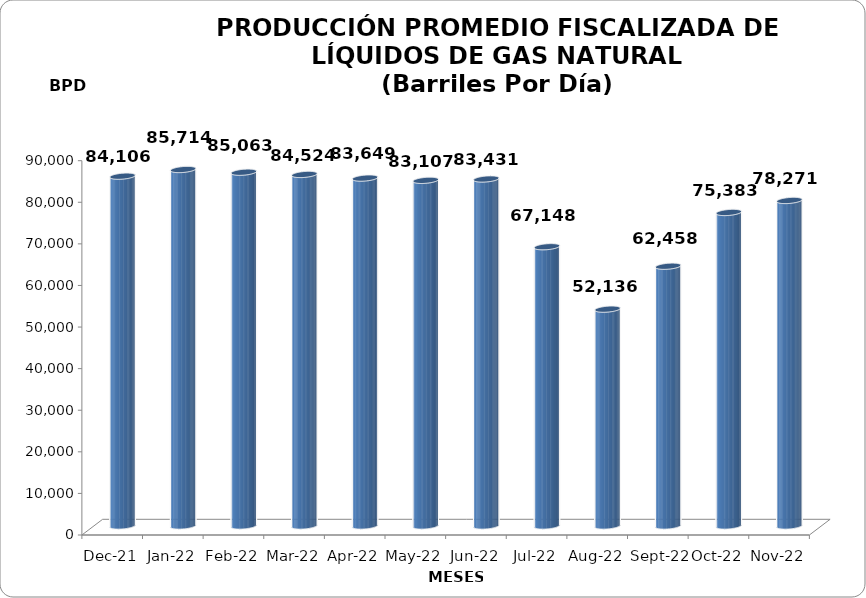
| Category | Series 0 |
|---|---|
| 2021-12-01 | 84106 |
| 2022-01-01 | 85714.355 |
| 2022-02-01 | 85063 |
| 2022-03-01 | 84523.548 |
| 2022-04-01 | 83649 |
| 2022-05-01 | 83107.387 |
| 2022-06-01 | 83430.867 |
| 2022-07-01 | 67147.806 |
| 2022-08-01 | 52135.548 |
| 2022-09-01 | 62458.2 |
| 2022-10-01 | 75383.161 |
| 2022-11-01 | 78270.633 |